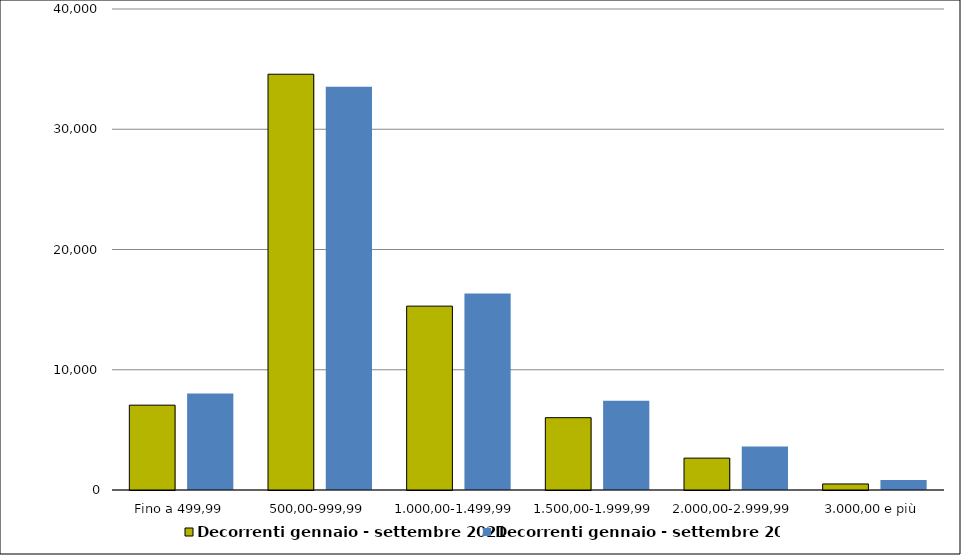
| Category | Decorrenti gennaio - settembre 2021 | Decorrenti gennaio - settembre 2020 |
|---|---|---|
|  Fino a 499,99  | 7055 | 8026 |
|  500,00-999,99  | 34576 | 33530 |
|  1.000,00-1.499,99  | 15291 | 16347 |
|  1.500,00-1.999,99  | 6014 | 7423 |
|  2.000,00-2.999,99  | 2650 | 3614 |
|  3.000,00 e più  | 502 | 829 |